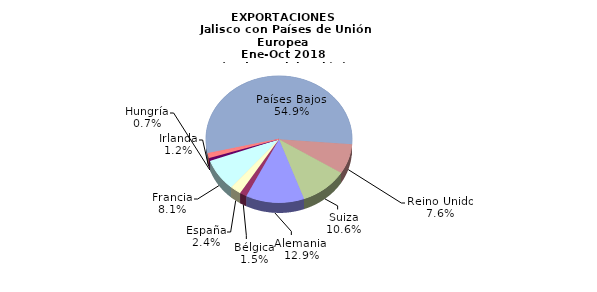
| Category | EXPORTACIONES |
|---|---|
| Alemania  | 708.011 |
| Bélgica | 83.876 |
| España | 134.037 |
| Francia | 445.758 |
| Hungría | 38.996 |
| Irlanda | 65.323 |
| Países Bajos  | 3011.655 |
| Reino Unido | 415.392 |
| Suiza | 579.665 |